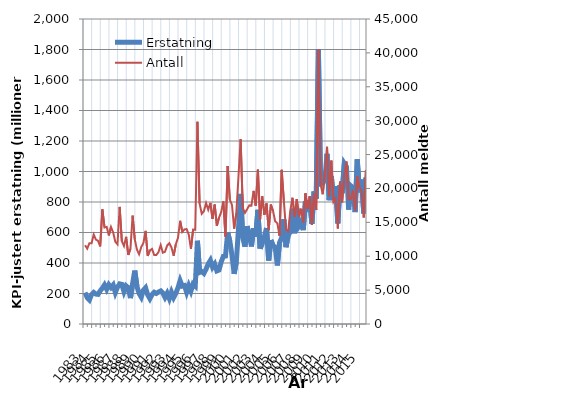
| Category | Erstatning |
|---|---|
| 1983.0 | 205.859 |
| nan | 172.439 |
| nan | 157.695 |
| nan | 193.17 |
| 1984.0 | 207.142 |
| nan | 195.941 |
| nan | 194.272 |
| nan | 217.294 |
| 1985.0 | 234.815 |
| nan | 256.66 |
| nan | 227.431 |
| nan | 257.937 |
| 1986.0 | 239.147 |
| nan | 255.898 |
| nan | 205.963 |
| nan | 241.024 |
| 1987.0 | 263.314 |
| nan | 259.842 |
| nan | 212.64 |
| nan | 250.177 |
| 1988.0 | 238.119 |
| nan | 169.742 |
| nan | 264.377 |
| nan | 350.226 |
| 1989.0 | 247.426 |
| nan | 199.98 |
| nan | 175.966 |
| nan | 222 |
| 1990.0 | 237.704 |
| nan | 191.233 |
| nan | 165.85 |
| nan | 193.043 |
| 1991.0 | 208.312 |
| nan | 200.291 |
| nan | 209.618 |
| nan | 216.719 |
| 1992.0 | 202.456 |
| nan | 174.447 |
| nan | 201.569 |
| nan | 166.334 |
| 1993.0 | 208.704 |
| nan | 173.688 |
| nan | 200.666 |
| nan | 237.394 |
| 1994.0 | 284.331 |
| nan | 248.57 |
| nan | 252.544 |
| nan | 208.159 |
| 1995.0 | 250.788 |
| nan | 215.752 |
| nan | 262.161 |
| nan | 248.909 |
| 1996.0 | 545.856 |
| nan | 338.003 |
| nan | 344.042 |
| nan | 331.801 |
| 1997.0 | 359.204 |
| nan | 394.166 |
| nan | 417.426 |
| nan | 372.44 |
| 1998.0 | 392.915 |
| nan | 348.086 |
| nan | 353.773 |
| nan | 406.622 |
| 1999.0 | 443.507 |
| nan | 445.662 |
| nan | 599.695 |
| nan | 543.103 |
| 2000.0 | 452.712 |
| nan | 328.768 |
| nan | 407.58 |
| nan | 621.434 |
| 2001.0 | 852.847 |
| nan | 564.588 |
| nan | 507.075 |
| nan | 641.553 |
| 2002.0 | 584.299 |
| nan | 508.397 |
| nan | 628.291 |
| nan | 572.513 |
| 2003.0 | 748.769 |
| nan | 495.059 |
| nan | 526.68 |
| nan | 573.74 |
| 2004.0 | 629.424 |
| nan | 416.133 |
| nan | 550.144 |
| nan | 514.216 |
| 2005.0 | 503.291 |
| nan | 384.081 |
| nan | 533.208 |
| nan | 565.067 |
| 2006.0 | 686.848 |
| nan | 503.708 |
| nan | 579.578 |
| nan | 604.661 |
| 2007.0 | 756.853 |
| nan | 595.046 |
| nan | 760.271 |
| nan | 642.795 |
| 2008.0 | 664.734 |
| nan | 615.377 |
| nan | 803.718 |
| nan | 771.888 |
| 2009.0 | 810.01 |
| nan | 657.599 |
| nan | 868.671 |
| nan | 821.076 |
| 2010.0 | 1801.107 |
| nan | 918.654 |
| nan | 923.074 |
| nan | 944.344 |
| 2011.0 | 1116.041 |
| nan | 811.559 |
| nan | 967.659 |
| nan | 815.509 |
| 2012.0 | 903.472 |
| nan | 660.521 |
| nan | 910.673 |
| nan | 857.485 |
| 2013.0 | 1053.081 |
| nan | 1031.165 |
| nan | 750.323 |
| nan | 906.303 |
| 2014.0 | 893.859 |
| nan | 734.034 |
| nan | 1079.804 |
| nan | 863.368 |
| 2015.0 | 947.227 |
| nan | 725.409 |
| nan | 960.235 |